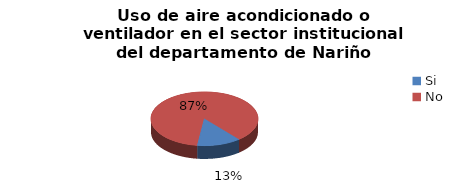
| Category | Series 0 |
|---|---|
| Si | 0.132 |
| No | 0.868 |